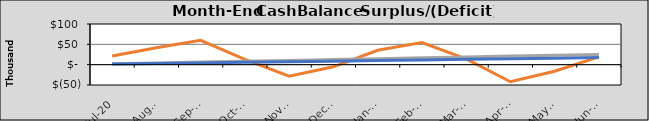
| Category | Final Cash | Original Cash | Revised Cash |
|---|---|---|---|
| 2020-07-01 | 21475.364 | 2107.414 | 1449.23 |
| 2020-08-01 | 41397.674 | 4214.828 | 2898.46 |
| 2020-09-01 | 59859.108 | 6322.242 | 4347.69 |
| 2020-10-02 | 12749.418 | 8429.656 | 5796.92 |
| 2020-11-02 | -28465.448 | 10537.07 | 7246.15 |
| 2020-12-03 | -5280.313 | 12644.484 | 8695.38 |
| 2021-01-03 | 35263.946 | 14751.898 | 10144.61 |
| 2021-02-03 | 54285.151 | 16859.312 | 11593.84 |
| 2021-03-06 | 14399.23 | 18966.726 | 13043.07 |
| 2021-04-06 | -42015.635 | 21074.14 | 14492.3 |
| 2021-05-07 | -16230.501 | 23181.554 | 15941.53 |
| 2021-06-07 | 19129.286 | 25288.968 | 17390.76 |